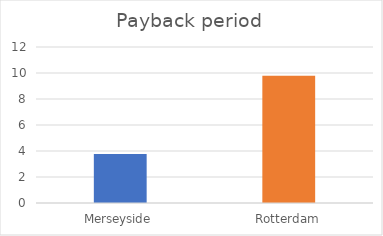
| Category | Series 0 |
|---|---|
| Merseyside | 3.77 |
| Rotterdam | 9.78 |